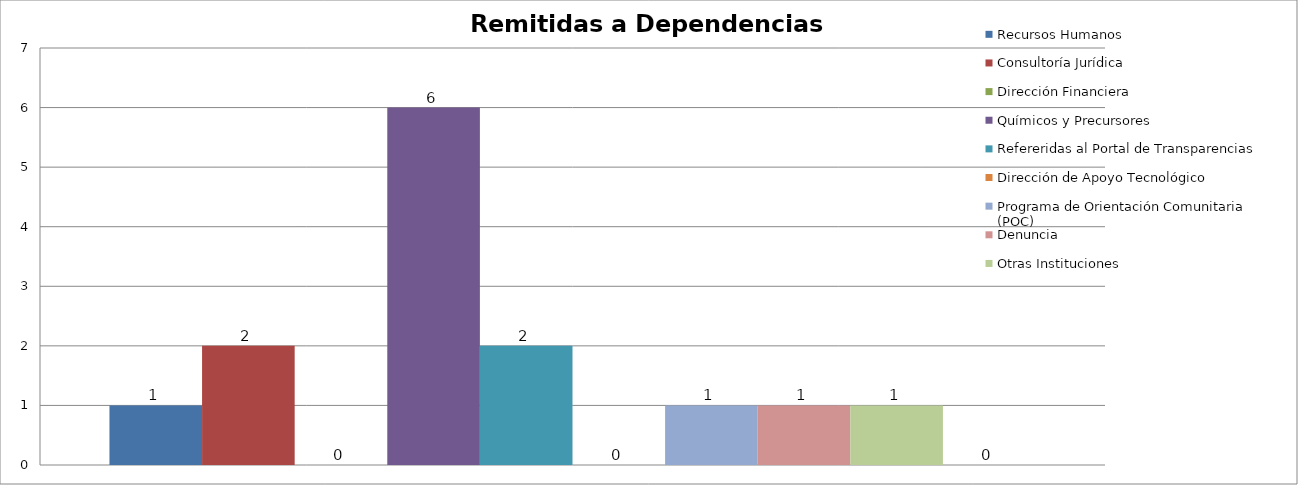
| Category | Recursos Humanos  | Consultoría Jurídica | Dirección Financiera | Químicos y Precursores | Refereridas al Portal de Transparencias | Dirección de Apoyo Tecnológico | Programa de Orientación Comunitaria (POC) | Denuncia | Otras Instituciones | Incompleta |
|---|---|---|---|---|---|---|---|---|---|---|
| 0 | 1 | 2 | 0 | 6 | 2 | 0 | 1 | 1 | 1 | 0 |